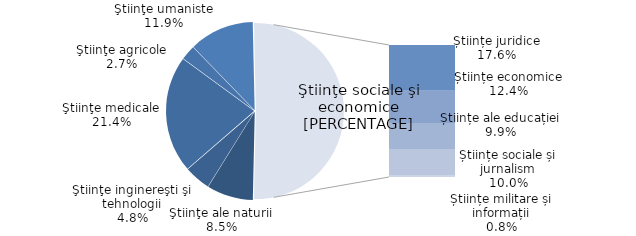
| Category | Series 0 |
|---|---|
| Ştiinţe ale naturii | 8.5 |
| Ştiinţe inginereşti şi tehnologii | 4.8 |
| Ştiinţe medicale | 21.4 |
| Ştiinţe agricole | 2.7 |
| Ştiinţe umaniste | 11.9 |
| Științe juridice | 17.6 |
| Științe economice | 12.4 |
| Științe ale educației | 9.9 |
| Științe sociale și jurnalism | 10 |
| Științe militare și informații | 0.8 |